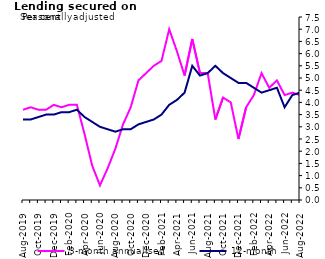
| Category | 3-month annualised | 12-month |
|---|---|---|
| Aug-2019 | 3.7 | 3.3 |
| Sep-2019 | 3.8 | 3.3 |
| Oct-2019 | 3.7 | 3.4 |
| Nov-2019 | 3.7 | 3.5 |
| Dec-2019 | 3.9 | 3.5 |
| Jan-2020 | 3.8 | 3.6 |
| Feb-2020 | 3.9 | 3.6 |
| Mar-2020 | 3.9 | 3.7 |
| Apr-2020 | 2.7 | 3.4 |
| May-2020 | 1.4 | 3.2 |
| Jun-2020 | 0.6 | 3 |
| Jul-2020 | 1.3 | 2.9 |
| Aug-2020 | 2.1 | 2.8 |
| Sep-2020 | 3.1 | 2.9 |
| Oct-2020 | 3.8 | 2.9 |
| Nov-2020 | 4.9 | 3.1 |
| Dec-2020 | 5.2 | 3.2 |
| Jan-2021 | 5.5 | 3.3 |
| Feb-2021 | 5.7 | 3.5 |
| Mar-2021 | 7 | 3.9 |
| Apr-2021 | 6.1 | 4.1 |
| May-2021 | 5.1 | 4.4 |
| Jun-2021 | 6.6 | 5.5 |
| Jul-2021 | 5.2 | 5.1 |
| Aug-2021 | 5.2 | 5.2 |
| Sep-2021 | 3.3 | 5.5 |
| Oct-2021 | 4.2 | 5.2 |
| Nov-2021 | 4 | 5 |
| Dec-2021 | 2.5 | 4.8 |
| Jan-2022 | 3.8 | 4.8 |
| Feb-2022 | 4.3 | 4.6 |
| Mar-2022 | 5.2 | 4.4 |
| Apr-2022 | 4.6 | 4.5 |
| May-2022 | 4.9 | 4.6 |
| Jun-2022 | 4.3 | 3.8 |
| Jul-2022 | 4.4 | 4.3 |
| Aug-2022 | 4.3 | 4.4 |